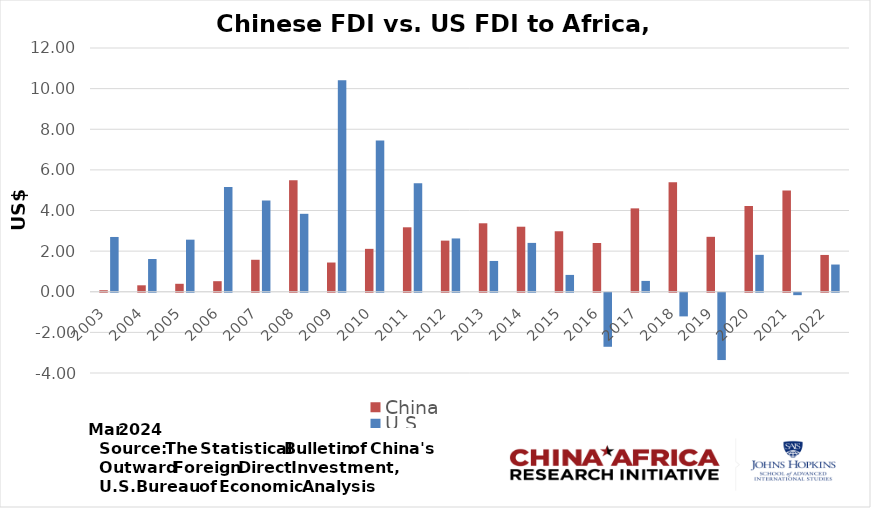
| Category | China | U.S. |
|---|---|---|
| 2003.0 | 0.075 | 2.697 |
| 2004.0 | 0.317 | 1.611 |
| 2005.0 | 0.392 | 2.564 |
| 2006.0 | 0.52 | 5.157 |
| 2007.0 | 1.574 | 4.49 |
| 2008.0 | 5.491 | 3.837 |
| 2009.0 | 1.439 | 10.417 |
| 2010.0 | 2.112 | 7.442 |
| 2011.0 | 3.173 | 5.34 |
| 2012.0 | 2.517 | 2.624 |
| 2013.0 | 3.371 | 1.516 |
| 2014.0 | 3.202 | 2.405 |
| 2015.0 | 2.978 | 0.829 |
| 2016.0 | 2.399 | -2.66 |
| 2017.0 | 4.105 | 0.534 |
| 2018.0 | 5.389 | -1.164 |
| 2019.0 | 2.704 | -3.313 |
| 2020.0 | 4.226 | 1.817 |
| 2021.0 | 4.987 | -0.119 |
| 2022.0 | 1.812 | 1.34 |